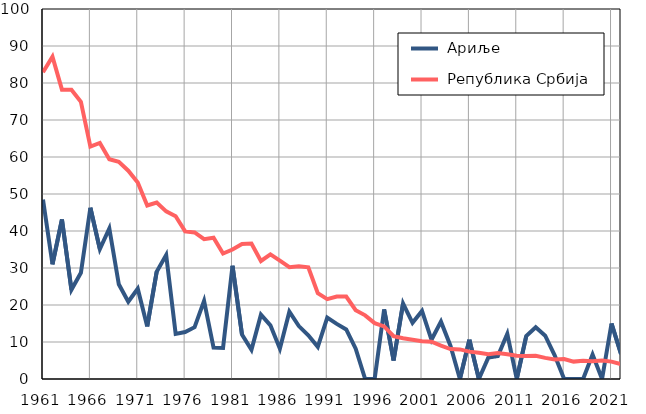
| Category |  Ариље |  Република Србија |
|---|---|---|
| 1961.0 | 48.5 | 82.9 |
| 1962.0 | 31 | 87.1 |
| 1963.0 | 43.1 | 78.2 |
| 1964.0 | 24.1 | 78.2 |
| 1965.0 | 28.7 | 74.9 |
| 1966.0 | 46.3 | 62.8 |
| 1967.0 | 35.1 | 63.8 |
| 1968.0 | 40.7 | 59.4 |
| 1969.0 | 25.6 | 58.7 |
| 1970.0 | 20.9 | 56.3 |
| 1971.0 | 24.4 | 53.1 |
| 1972.0 | 14.2 | 46.9 |
| 1973.0 | 29 | 47.7 |
| 1974.0 | 33.5 | 45.3 |
| 1975.0 | 12.2 | 44 |
| 1976.0 | 12.7 | 39.9 |
| 1977.0 | 14 | 39.6 |
| 1978.0 | 21.1 | 37.8 |
| 1979.0 | 8.5 | 38.2 |
| 1980.0 | 8.4 | 33.9 |
| 1981.0 | 30.6 | 35 |
| 1982.0 | 12 | 36.5 |
| 1983.0 | 7.9 | 36.6 |
| 1984.0 | 17.4 | 31.9 |
| 1985.0 | 14.5 | 33.7 |
| 1986.0 | 8.2 | 32 |
| 1987.0 | 18.2 | 30.2 |
| 1988.0 | 14.3 | 30.5 |
| 1989.0 | 11.8 | 30.2 |
| 1990.0 | 8.7 | 23.2 |
| 1991.0 | 16.6 | 21.6 |
| 1992.0 | 14.9 | 22.3 |
| 1993.0 | 13.4 | 22.3 |
| 1994.0 | 8.2 | 18.6 |
| 1995.0 | 0 | 17.2 |
| 1996.0 | 0 | 15.1 |
| 1997.0 | 18.8 | 14.2 |
| 1998.0 | 5 | 11.6 |
| 1999.0 | 20.4 | 11 |
| 2000.0 | 15.2 | 10.6 |
| 2001.0 | 18.4 | 10.2 |
| 2002.0 | 10.6 | 10.1 |
| 2003.0 | 15.5 | 9 |
| 2004.0 | 9 | 8.1 |
| 2005.0 | 0 | 8 |
| 2006.0 | 10.6 | 7.4 |
| 2007.0 | 0 | 7.1 |
| 2008.0 | 5.8 | 6.7 |
| 2009.0 | 6.2 | 7 |
| 2010.0 | 12.2 | 6.7 |
| 2011.0 | 0 | 6.3 |
| 2012.0 | 11.6 | 6.2 |
| 2013.0 | 14 | 6.3 |
| 2014.0 | 11.7 | 5.7 |
| 2015.0 | 6.4 | 5.3 |
| 2016.0 | 0 | 5.4 |
| 2017.0 | 0 | 4.7 |
| 2018.0 | 0 | 4.9 |
| 2019.0 | 6.6 | 4.8 |
| 2020.0 | 0 | 5 |
| 2021.0 | 15 | 4.7 |
| 2022.0 | 6.8 | 4 |